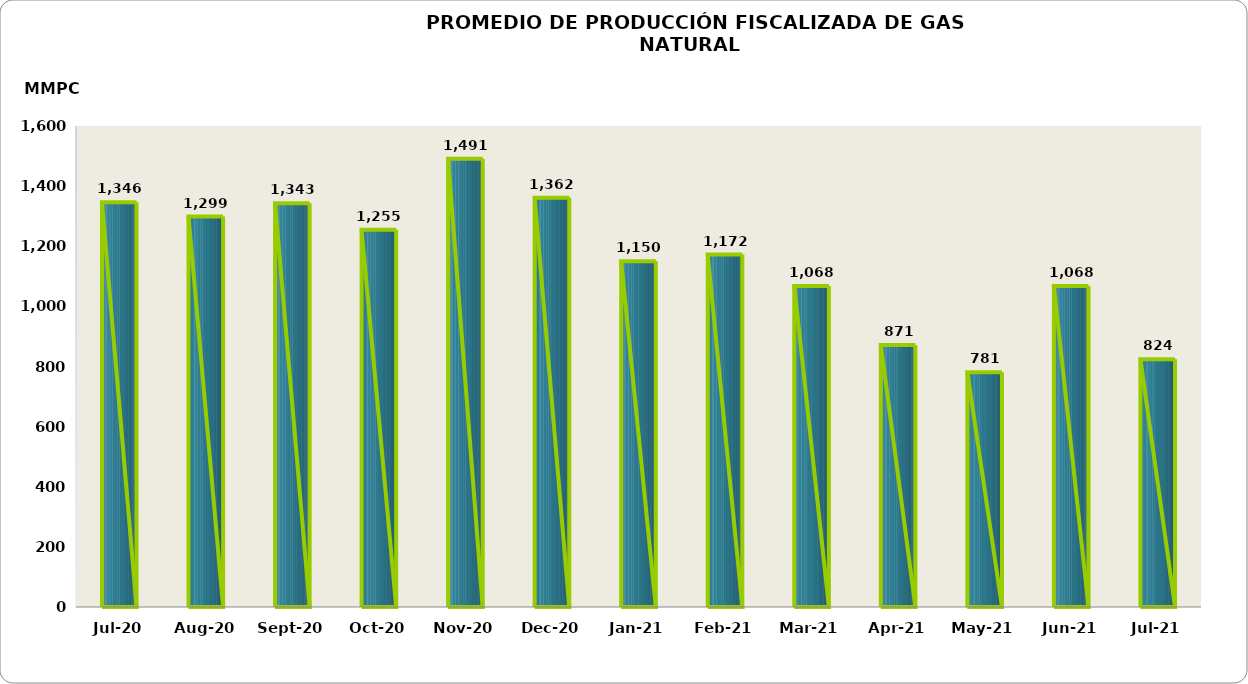
| Category | Series 0 |
|---|---|
| 2020-07-01 | 1346101.494 |
| 2020-08-01 | 1298655.154 |
| 2020-09-01 | 1342976.236 |
| 2020-10-01 | 1254828.351 |
| 2020-11-01 | 1490754.692 |
| 2020-12-01 | 1361515.502 |
| 2021-01-01 | 1150031.71 |
| 2021-02-01 | 1172289.733 |
| 2021-03-01 | 1067744.591 |
| 2021-04-01 | 871274.072 |
| 2021-05-01 | 780865.314 |
| 2021-06-01 | 1068128.403 |
| 2021-07-01 | 823834.105 |